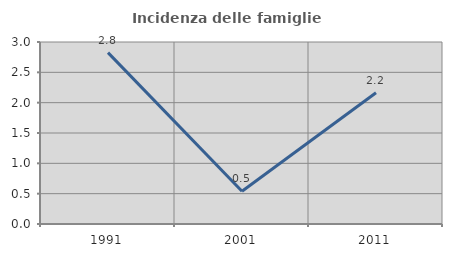
| Category | Incidenza delle famiglie numerose |
|---|---|
| 1991.0 | 2.825 |
| 2001.0 | 0.541 |
| 2011.0 | 2.162 |